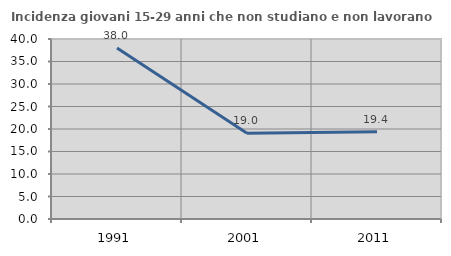
| Category | Incidenza giovani 15-29 anni che non studiano e non lavorano  |
|---|---|
| 1991.0 | 37.988 |
| 2001.0 | 19.036 |
| 2011.0 | 19.406 |